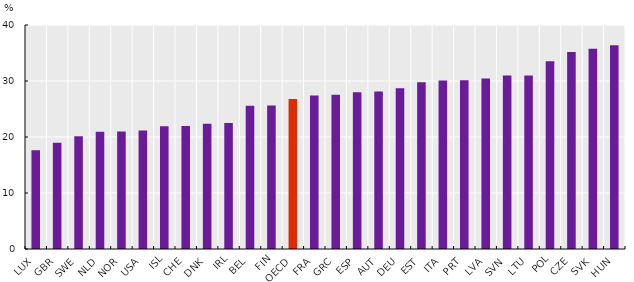
| Category | Series 0 |
|---|---|
| LUX | 17.652 |
| GBR | 18.963 |
| SWE | 20.143 |
| NLD | 20.929 |
| NOR | 21 |
| USA | 21.18 |
| ISL | 21.923 |
| CHE | 21.958 |
| DNK | 22.362 |
| IRL | 22.488 |
| BEL | 25.572 |
| FIN | 25.629 |
| OECD | 26.772 |
| FRA | 27.39 |
| GRC | 27.56 |
| ESP | 27.989 |
| AUT | 28.145 |
| DEU | 28.705 |
| EST | 29.782 |
| ITA | 30.074 |
| PRT | 30.122 |
| LVA | 30.466 |
| SVN | 30.981 |
| LTU | 31.003 |
| POL | 33.535 |
| CZE | 35.188 |
| SVK | 35.743 |
| HUN | 36.369 |